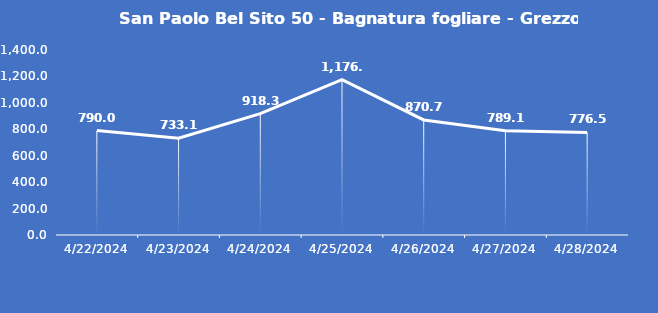
| Category | San Paolo Bel Sito 50 - Bagnatura fogliare - Grezzo (min) |
|---|---|
| 4/22/24 | 790 |
| 4/23/24 | 733.1 |
| 4/24/24 | 918.3 |
| 4/25/24 | 1176.1 |
| 4/26/24 | 870.7 |
| 4/27/24 | 789.1 |
| 4/28/24 | 776.5 |